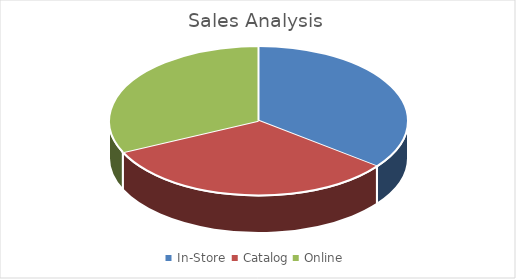
| Category | Series 0 |
|---|---|
| In-Store  | 254176.92 |
| Catalog | 233904.81 |
| Online | 228916.13 |